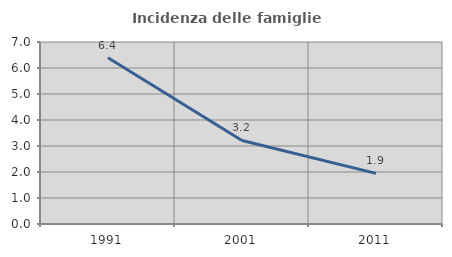
| Category | Incidenza delle famiglie numerose |
|---|---|
| 1991.0 | 6.393 |
| 2001.0 | 3.212 |
| 2011.0 | 1.948 |